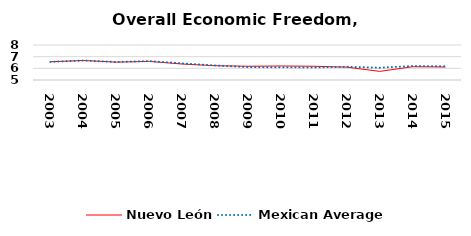
| Category | Nuevo León | Mexican Average  |
|---|---|---|
| 2003.0 | 6.562 | 6.552 |
| 2004.0 | 6.675 | 6.668 |
| 2005.0 | 6.53 | 6.546 |
| 2006.0 | 6.597 | 6.619 |
| 2007.0 | 6.369 | 6.428 |
| 2008.0 | 6.225 | 6.248 |
| 2009.0 | 6.177 | 6.106 |
| 2010.0 | 6.201 | 6.086 |
| 2011.0 | 6.178 | 6.074 |
| 2012.0 | 6.103 | 6.134 |
| 2013.0 | 5.738 | 6.054 |
| 2014.0 | 6.137 | 6.2 |
| 2015.0 | 6.116 | 6.174 |